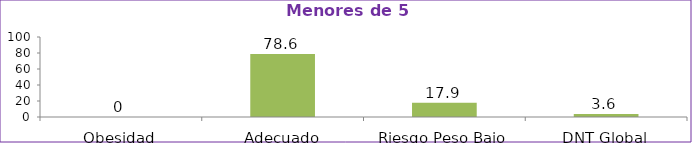
| Category | Series 0 |
|---|---|
| Obesidad | 0 |
| Adecuado | 78.6 |
| Riesgo Peso Bajo | 17.9 |
| DNT Global | 3.6 |